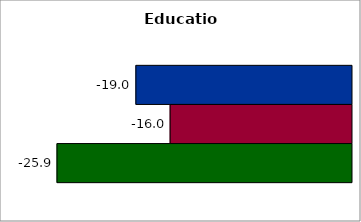
| Category | 50 states and D.C. | SREB states | State |
|---|---|---|---|
| 0 | -18.969 | -15.957 | -25.909 |